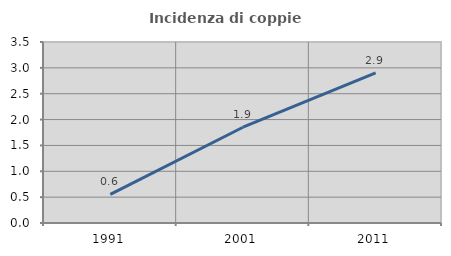
| Category | Incidenza di coppie miste |
|---|---|
| 1991.0 | 0.555 |
| 2001.0 | 1.852 |
| 2011.0 | 2.903 |